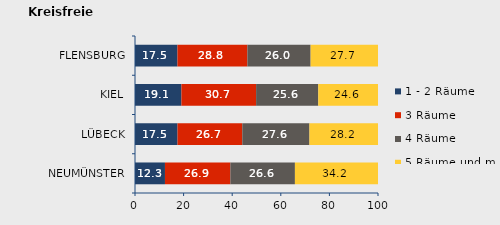
| Category | 1 - 2 Räume | 3 Räume | 4 Räume | 5 Räume und mehr |
|---|---|---|---|---|
| NEUMÜNSTER | 12.331 | 26.914 | 26.566 | 34.189 |
| LÜBECK | 17.501 | 26.663 | 27.624 | 28.212 |
| KIEL | 19.105 | 30.73 | 25.582 | 24.583 |
| FLENSBURG | 17.475 | 28.775 | 26.021 | 27.728 |